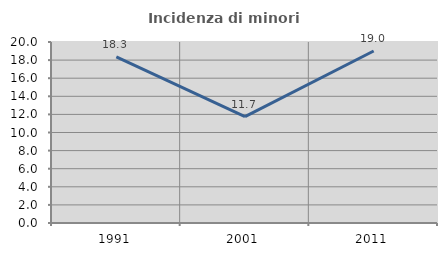
| Category | Incidenza di minori stranieri |
|---|---|
| 1991.0 | 18.349 |
| 2001.0 | 11.745 |
| 2011.0 | 19.006 |